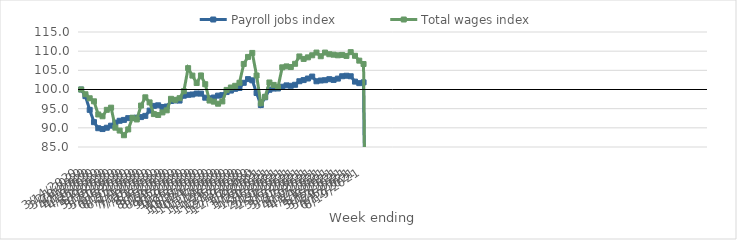
| Category | Payroll jobs index | Total wages index |
|---|---|---|
| 14/03/2020 | 100 | 100 |
| 21/03/2020 | 98.264 | 98.762 |
| 28/03/2020 | 94.689 | 97.714 |
| 04/04/2020 | 91.483 | 96.921 |
| 11/04/2020 | 89.901 | 93.485 |
| 18/04/2020 | 89.681 | 93.018 |
| 25/04/2020 | 90.028 | 94.697 |
| 02/05/2020 | 90.562 | 95.262 |
| 09/05/2020 | 91.354 | 90.043 |
| 16/05/2020 | 91.843 | 89.292 |
| 23/05/2020 | 92.071 | 88.068 |
| 30/05/2020 | 92.529 | 89.582 |
| 06/06/2020 | 92.588 | 92.621 |
| 13/06/2020 | 92.648 | 92.186 |
| 20/06/2020 | 92.805 | 95.814 |
| 27/06/2020 | 93.123 | 97.959 |
| 04/07/2020 | 94.505 | 96.636 |
| 11/07/2020 | 95.721 | 93.585 |
| 18/07/2020 | 95.873 | 93.35 |
| 25/07/2020 | 95.429 | 94.023 |
| 01/08/2020 | 95.565 | 94.564 |
| 08/08/2020 | 97 | 97.569 |
| 15/08/2020 | 97.131 | 97.312 |
| 22/08/2020 | 97.112 | 97.731 |
| 29/08/2020 | 98.378 | 99.559 |
| 05/09/2020 | 98.609 | 105.569 |
| 12/09/2020 | 98.699 | 103.623 |
| 19/09/2020 | 98.949 | 101.69 |
| 26/09/2020 | 98.932 | 103.664 |
| 03/10/2020 | 97.861 | 101.376 |
| 10/10/2020 | 97.692 | 97.12 |
| 17/10/2020 | 97.902 | 96.828 |
| 24/10/2020 | 98.401 | 96.295 |
| 31/10/2020 | 98.526 | 96.892 |
| 07/11/2020 | 99.334 | 99.897 |
| 14/11/2020 | 99.722 | 100.521 |
| 21/11/2020 | 100.171 | 100.964 |
| 28/11/2020 | 100.394 | 101.764 |
| 05/12/2020 | 101.748 | 106.663 |
| 12/12/2020 | 102.714 | 108.503 |
| 19/12/2020 | 102.396 | 109.54 |
| 26/12/2020 | 99.094 | 103.648 |
| 02/01/2021 | 95.946 | 96.405 |
| 09/01/2021 | 97.967 | 98.112 |
| 16/01/2021 | 99.926 | 101.832 |
| 23/01/2021 | 100.246 | 101.201 |
| 30/01/2021 | 100.267 | 100.6 |
| 06/02/2021 | 100.721 | 105.784 |
| 13/02/2021 | 101.074 | 106.025 |
| 20/02/2021 | 100.965 | 105.858 |
| 27/02/2021 | 101.232 | 106.705 |
| 06/03/2021 | 102.154 | 108.622 |
| 13/03/2021 | 102.458 | 107.974 |
| 20/03/2021 | 102.863 | 108.385 |
| 27/03/2021 | 103.373 | 108.927 |
| 03/04/2021 | 102.145 | 109.635 |
| 10/04/2021 | 102.34 | 108.677 |
| 17/04/2021 | 102.424 | 109.632 |
| 24/04/2021 | 102.694 | 109.204 |
| 01/05/2021 | 102.502 | 109.084 |
| 08/05/2021 | 102.838 | 108.921 |
| 15/05/2021 | 103.46 | 109.023 |
| 22/05/2021 | 103.588 | 108.762 |
| 29/05/2021 | 103.453 | 109.744 |
| 05/06/2021 | 102.056 | 108.789 |
| 12/06/2021 | 101.652 | 107.528 |
| 19/06/2021 | 101.866 | 106.645 |